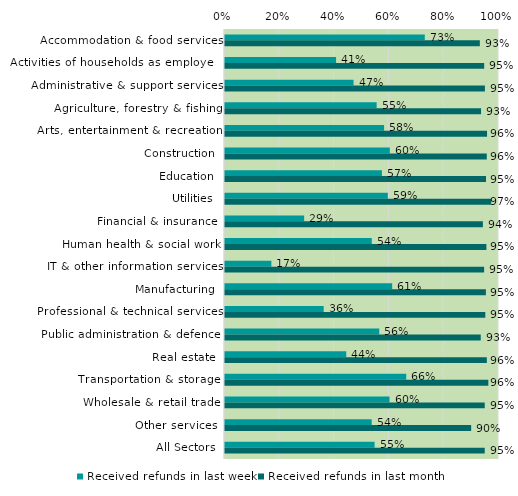
| Category | Received refunds in last week | Received refunds in last month |
|---|---|---|
| Accommodation & food services | 0.729 | 0.93 |
| Activities of households as employers | 0.405 | 0.946 |
| Administrative & support services | 0.469 | 0.949 |
| Agriculture, forestry & fishing | 0.553 | 0.934 |
| Arts, entertainment & recreation | 0.581 | 0.956 |
| Construction | 0.601 | 0.955 |
| Education | 0.573 | 0.953 |
| Utilities | 0.594 | 0.972 |
| Financial & insurance | 0.289 | 0.941 |
| Human health & social work | 0.536 | 0.954 |
| IT & other information services | 0.169 | 0.946 |
| Manufacturing | 0.61 | 0.952 |
| Professional & technical services | 0.36 | 0.95 |
| Public administration & defence | 0.563 | 0.933 |
| Real estate | 0.443 | 0.956 |
| Transportation & storage | 0.661 | 0.961 |
| Wholesale & retail trade | 0.6 | 0.948 |
| Other services | 0.535 | 0.898 |
| All Sectors | 0.546 | 0.948 |